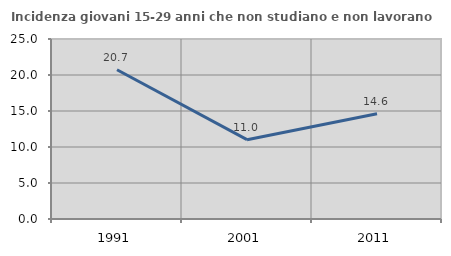
| Category | Incidenza giovani 15-29 anni che non studiano e non lavorano  |
|---|---|
| 1991.0 | 20.733 |
| 2001.0 | 11.015 |
| 2011.0 | 14.624 |